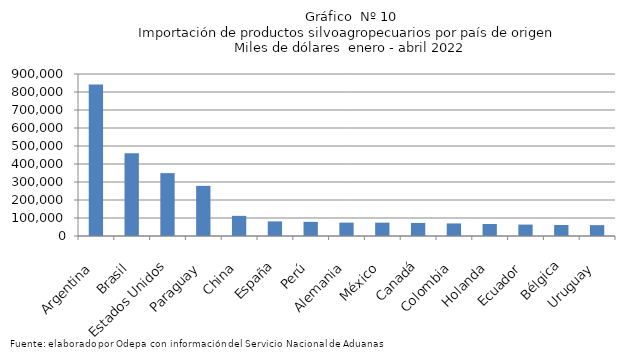
| Category | Series 0 |
|---|---|
| Argentina | 841207.147 |
| Brasil | 459894.158 |
| Estados Unidos | 349379.161 |
| Paraguay | 278515.263 |
| China | 111927.3 |
| España | 81207.131 |
| Perú | 78544.375 |
| Alemania | 74326.402 |
| México | 74054.814 |
| Canadá | 72539.058 |
| Colombia | 69795.147 |
| Holanda | 66600.93 |
| Ecuador | 63518.249 |
| Bélgica | 61269.834 |
| Uruguay | 60343 |